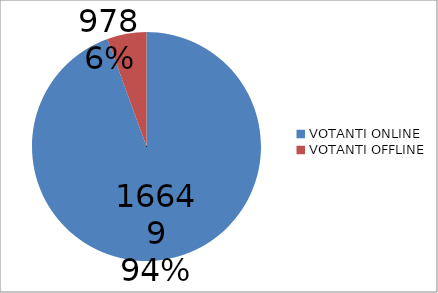
| Category | Series 0 |
|---|---|
| VOTANTI ONLINE | 16649 |
| VOTANTI OFFLINE | 978 |